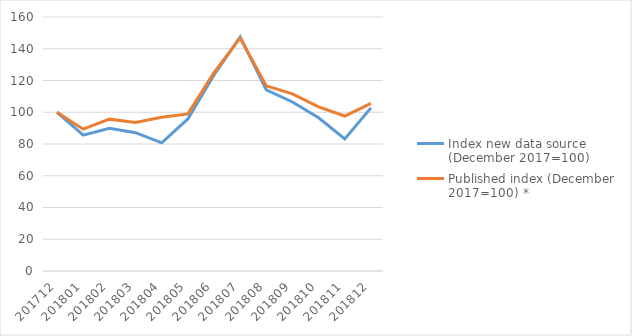
| Category | Index new data source (December 2017=100) | Published index (December 2017=100) * |
|---|---|---|
| 201712.0 | 100 | 100 |
| 201801.0 | 85.57 | 89.34 |
| 201802.0 | 89.88 | 95.65 |
| 201803.0 | 87.11 | 93.56 |
| 201804.0 | 80.73 | 96.89 |
| 201805.0 | 95.78 | 98.98 |
| 201806.0 | 123.45 | 124.9 |
| 201807.0 | 147.44 | 146.82 |
| 201808.0 | 114.08 | 116.62 |
| 201809.0 | 106.45 | 111.54 |
| 201810.0 | 96.52 | 103.43 |
| 201811.0 | 83.22 | 97.62 |
| 201812.0 | 102.75 | 105.55 |